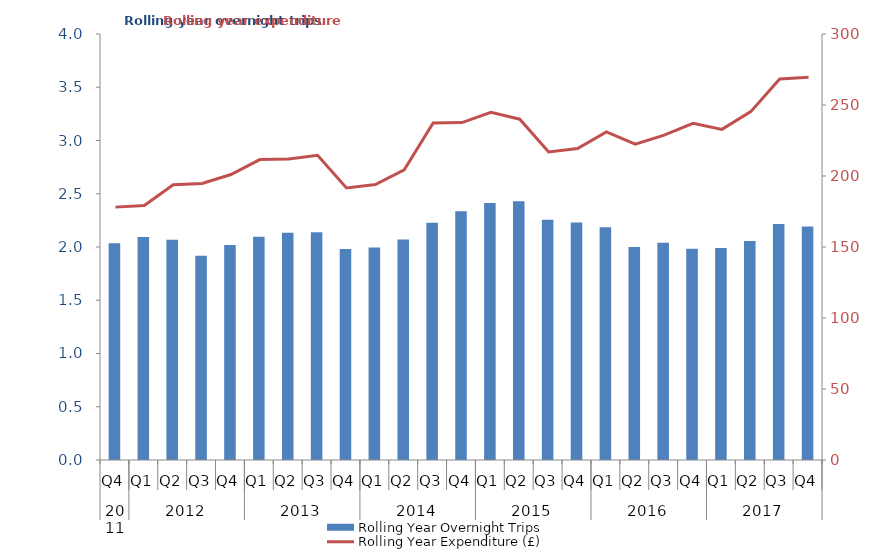
| Category | Rolling Year Overnight Trips |
|---|---|
| 0 | 2036136.054 |
| 1 | 2093276.107 |
| 2 | 2068898.787 |
| 3 | 1916896.49 |
| 4 | 2018069.254 |
| 5 | 2095759.702 |
| 6 | 2134636.175 |
| 7 | 2139044.06 |
| 8 | 1980169.846 |
| 9 | 1996065.689 |
| 10 | 2070866.117 |
| 11 | 2226529.659 |
| 12 | 2334626.826 |
| 13 | 2412847.728 |
| 14 | 2429284.604 |
| 15 | 2255913.169 |
| 16 | 2230216.112 |
| 17 | 2184306.916 |
| 18 | 2000660.711 |
| 19 | 2039408.739 |
| 20 | 1984392.093 |
| 21 | 1990446.648 |
| 22 | 2056196.743 |
| 23 | 2215700.381 |
| 24 | 2193428.406 |